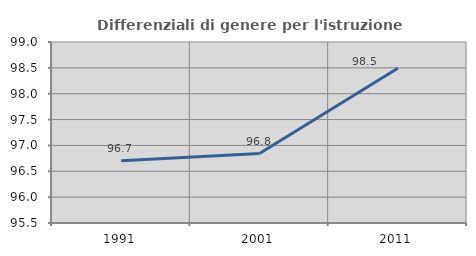
| Category | Differenziali di genere per l'istruzione superiore |
|---|---|
| 1991.0 | 96.706 |
| 2001.0 | 96.843 |
| 2011.0 | 98.493 |